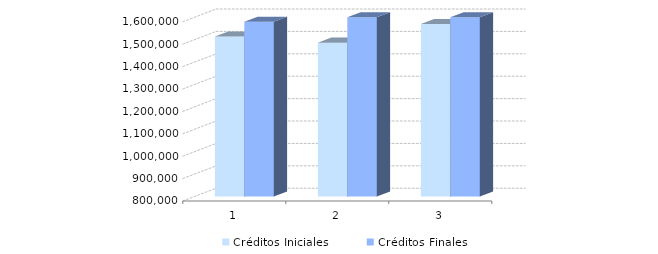
| Category | Créditos Iniciales | Créditos Finales |
|---|---|---|
| 0 | 1513893 | 1579757.67 |
| 1 | 1487061.28 | 1774024.81 |
| 2 | 1569828.12 | 2032170.41 |